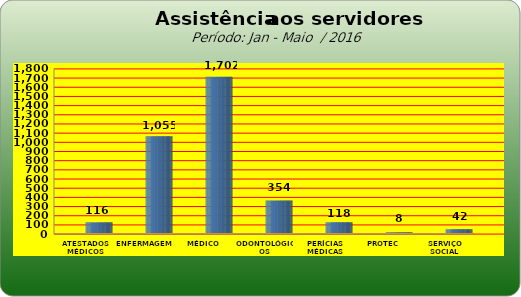
| Category | Series 0 |
|---|---|
| ATESTADOS MÉDICOS | 116 |
| ENFERMAGEM | 1055 |
| MÉDICO | 1702 |
| ODONTOLÓGICOS | 354 |
| PERÍCIAS MÉDICAS | 118 |
| PROTEC | 8 |
| SERVIÇO SOCIAL | 42 |